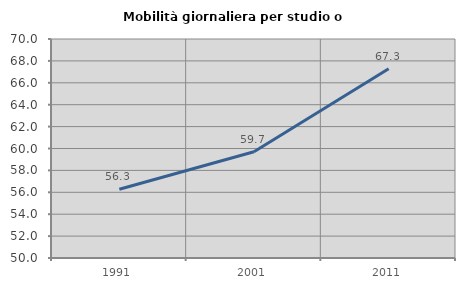
| Category | Mobilità giornaliera per studio o lavoro |
|---|---|
| 1991.0 | 56.283 |
| 2001.0 | 59.706 |
| 2011.0 | 67.291 |